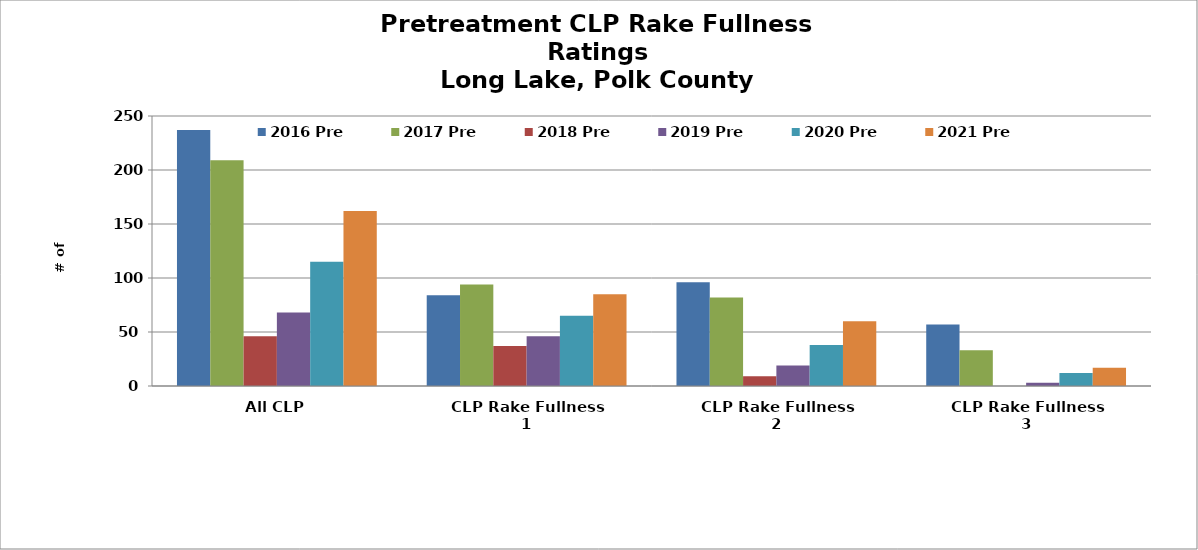
| Category | 2016 Pre | 2017 Pre | 2018 Pre | 2019 Pre | 2020 Pre | 2021 Pre |
|---|---|---|---|---|---|---|
| All CLP | 237 | 209 | 46 | 68 | 115 | 162 |
| CLP Rake Fullness 1 | 84 | 94 | 37 | 46 | 65 | 85 |
| CLP Rake Fullness 2 | 96 | 82 | 9 | 19 | 38 | 60 |
| CLP Rake Fullness 3 | 57 | 33 | 0 | 3 | 12 | 17 |